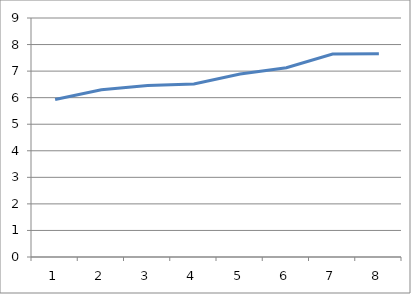
| Category | Series 0 |
|---|---|
| 0 | 5.928 |
| 1 | 6.299 |
| 2 | 6.458 |
| 3 | 6.519 |
| 4 | 6.892 |
| 5 | 7.128 |
| 6 | 7.646 |
| 7 | 7.656 |